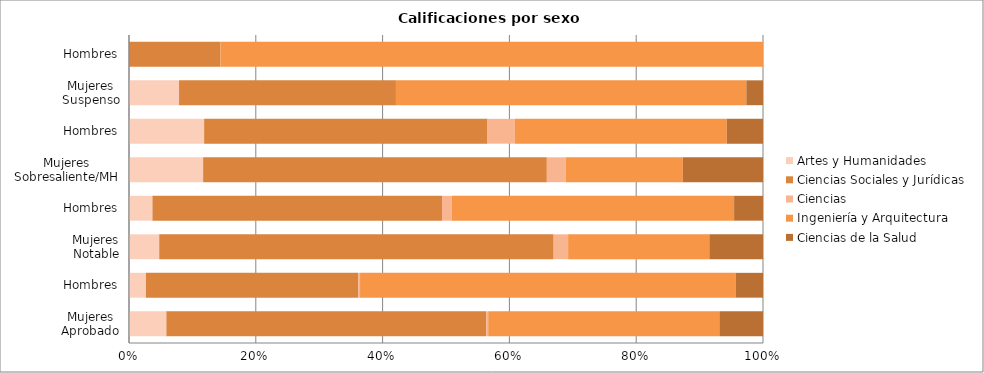
| Category | Artes y Humanidades | Ciencias Sociales y Jurídicas | Ciencias | Ingeniería y Arquitectura | Ciencias de la Salud |
|---|---|---|---|---|---|
| 0 | 54 | 462 | 3 | 334 | 63 |
| 1 | 30 | 377 | 3 | 667 | 48 |
| 2 | 155 | 2022 | 74 | 724 | 275 |
| 3 | 86 | 1062 | 35 | 1036 | 106 |
| 4 | 297 | 1377 | 76 | 469 | 321 |
| 5 | 189 | 713 | 69 | 533 | 91 |
| 6 | 3 | 13 | 0 | 21 | 1 |
| 7 | 0 | 15 | 0 | 89 | 0 |